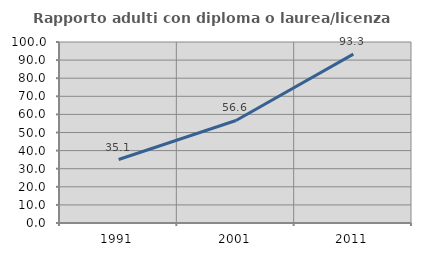
| Category | Rapporto adulti con diploma o laurea/licenza media  |
|---|---|
| 1991.0 | 35.075 |
| 2001.0 | 56.633 |
| 2011.0 | 93.274 |